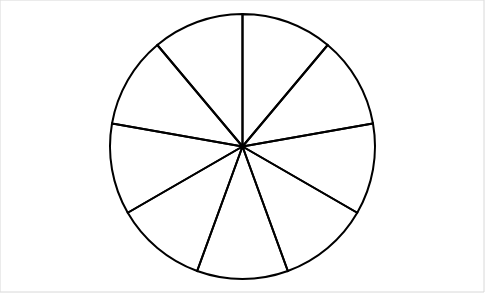
| Category | Sector weight |
|---|---|
| 8a | 1 |
| 8b | 1 |
| 8d | 1 |
| 8e | 1 |
| 8f | 1 |
| 8g | 1 |
| 8h | 1 |
| 8i | 1 |
| 8j | 1 |